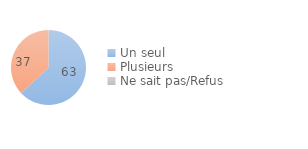
| Category | Series 0 |
|---|---|
| Un seul | 63 |
| Plusieurs  | 37 |
| Ne sait pas/Refus | 0 |